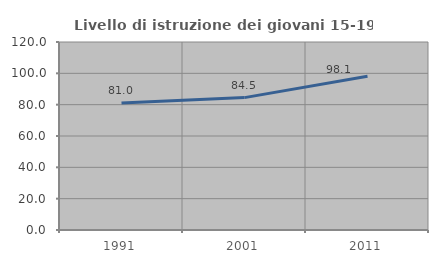
| Category | Livello di istruzione dei giovani 15-19 anni |
|---|---|
| 1991.0 | 81.046 |
| 2001.0 | 84.496 |
| 2011.0 | 98.077 |